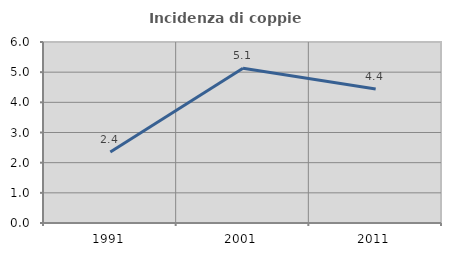
| Category | Incidenza di coppie miste |
|---|---|
| 1991.0 | 2.353 |
| 2001.0 | 5.128 |
| 2011.0 | 4.444 |